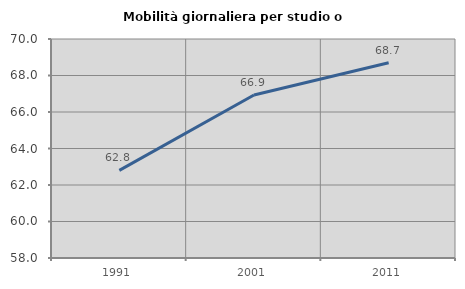
| Category | Mobilità giornaliera per studio o lavoro |
|---|---|
| 1991.0 | 62.8 |
| 2001.0 | 66.928 |
| 2011.0 | 68.696 |